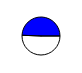
| Category | Series 0 |
|---|---|
| 0 | 8581386 |
| 1 | 8369979 |